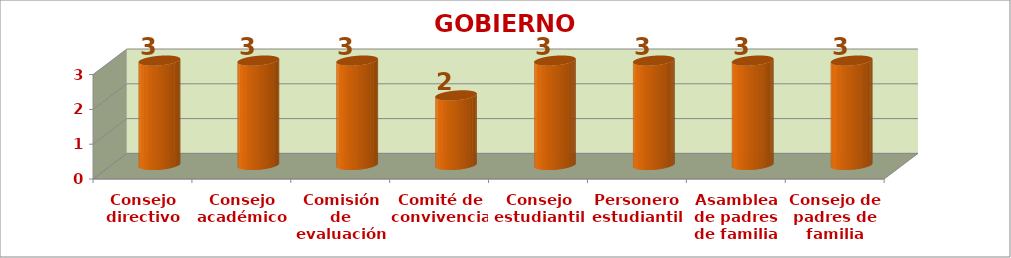
| Category | GOBIERNO ESCOLAR |
|---|---|
| Consejo directivo | 3 |
| Consejo académico | 3 |
| Comisión de evaluación y
promoción | 3 |
| Comité de convivencia | 2 |
| Consejo estudiantil | 3 |
| Personero estudiantil | 3 |
| Asamblea de padres de familia | 3 |
| Consejo de padres de familia | 3 |